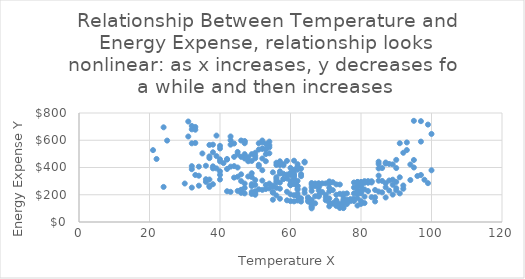
| Category | Energy Expense Y |
|---|---|
| 46.0 | 236 |
| 52.0 | 304 |
| 55.0 | 163.5 |
| 46.0 | 214 |
| 47.0 | 210 |
| 50.0 | 508 |
| 36.0 | 294.55 |
| 47.0 | 250 |
| 40.0 | 371.95 |
| 46.0 | 478 |
| 55.0 | 258 |
| 40.0 | 559 |
| 53.0 | 536 |
| 44.0 | 576 |
| 48.0 | 446 |
| 46.0 | 300 |
| 56.0 | 250.5 |
| 36.0 | 412.8 |
| 38.0 | 511.7 |
| 37.0 | 311.75 |
| 44.0 | 478 |
| 30.0 | 282.5 |
| 48.0 | 476 |
| 37.0 | 565.45 |
| 43.0 | 567.6 |
| 39.0 | 634.25 |
| 34.0 | 266.6 |
| 33.0 | 345 |
| 38.0 | 393.45 |
| 38.0 | 567.6 |
| 37.0 | 266.6 |
| 35.0 | 503.1 |
| 53.0 | 242 |
| 55.0 | 216 |
| 58.0 | 354 |
| 41.0 | 432.15 |
| 43.0 | 406.35 |
| 43.0 | 627.8 |
| 32.0 | 705 |
| 53.0 | 534 |
| 54.0 | 282 |
| 56.0 | 435 |
| 52.0 | 380 |
| 57.0 | 372 |
| 51.0 | 240 |
| 40.0 | 346.15 |
| 32.0 | 577.5 |
| 34.0 | 406.35 |
| 37.0 | 468.7 |
| 39.0 | 483.75 |
| 22.0 | 462.5 |
| 38.0 | 408.5 |
| 40.0 | 311.75 |
| 51.0 | 420 |
| 32.0 | 410 |
| 45.0 | 400 |
| 40.0 | 460.1 |
| 52.0 | 538 |
| 25.0 | 597.5 |
| 42.0 | 389.15 |
| 45.0 | 228 |
| 31.0 | 627.5 |
| 51.0 | 408 |
| 34.0 | 339.7 |
| 21.0 | 527.5 |
| 55.0 | 364.5 |
| 24.0 | 695 |
| 42.0 | 462.25 |
| 38.0 | 277.35 |
| 48.0 | 334 |
| 40.0 | 445.05 |
| 45.0 | 496 |
| 45.0 | 514 |
| 46.0 | 350 |
| 33.0 | 697.5 |
| 37.0 | 258 |
| 24.0 | 257.5 |
| 36.0 | 313.9 |
| 37.0 | 481.6 |
| 47.0 | 594 |
| 64.0 | 442.5 |
| 60.0 | 397.5 |
| 50.0 | 272 |
| 62.0 | 208.5 |
| 50.0 | 200 |
| 62.0 | 301.5 |
| 68.0 | 187 |
| 65.0 | 150 |
| 57.0 | 445.5 |
| 53.0 | 498 |
| 43.0 | 599.85 |
| 39.0 | 393.45 |
| 61.0 | 196.5 |
| 42.0 | 457.95 |
| 42.0 | 225.75 |
| 52.0 | 598 |
| 68.0 | 268 |
| 50.0 | 468 |
| 46.0 | 236 |
| 58.0 | 415.5 |
| 56.0 | 418.5 |
| 61.0 | 279 |
| 56.0 | 195 |
| 61.0 | 325.5 |
| 67.0 | 283 |
| 68.0 | 281 |
| 61.0 | 313.5 |
| 52.0 | 466 |
| 63.0 | 351 |
| 80.0 | 226 |
| 75.0 | 165 |
| 51.0 | 532 |
| 44.0 | 410 |
| 79.0 | 121 |
| 61.0 | 340.5 |
| 49.0 | 264 |
| 80.0 | 212 |
| 47.0 | 590 |
| 77.0 | 153 |
| 60.0 | 202.5 |
| 54.0 | 564 |
| 44.0 | 326 |
| 50.0 | 308 |
| 69.0 | 220 |
| 59.0 | 448.5 |
| 81.0 | 239 |
| 82.0 | 227 |
| 59.0 | 222 |
| 47.0 | 282 |
| 71.0 | 225 |
| 45.0 | 332 |
| 65.0 | 178 |
| 78.0 | 290 |
| 54.0 | 246 |
| 46.0 | 598 |
| 81.0 | 186 |
| 52.0 | 584 |
| 79.0 | 259 |
| 77.0 | 162 |
| 66.0 | 162 |
| 60.0 | 300 |
| 66.0 | 228 |
| 63.0 | 336 |
| 76.0 | 164 |
| 64.0 | 238.5 |
| 54.0 | 548 |
| 62.0 | 187.5 |
| 75.0 | 208 |
| 60.0 | 153 |
| 61.0 | 343.5 |
| 74.0 | 275 |
| 72.0 | 138 |
| 77.0 | 168 |
| 56.0 | 289.5 |
| 73.0 | 156 |
| 60.0 | 345 |
| 72.0 | 292 |
| 66.0 | 100 |
| 57.0 | 355.5 |
| 57.0 | 171 |
| 78.0 | 253 |
| 56.0 | 303 |
| 59.0 | 319.5 |
| 71.0 | 115 |
| 66.0 | 133 |
| 58.0 | 318 |
| 67.0 | 137 |
| 66.0 | 275 |
| 76.0 | 132 |
| 57.0 | 244.5 |
| 72.0 | 135 |
| 62.0 | 246 |
| 79.0 | 222 |
| 83.0 | 297 |
| 71.0 | 173 |
| 78.0 | 154 |
| 70.0 | 160 |
| 81.0 | 139 |
| 74.0 | 103 |
| 92.0 | 508 |
| 78.0 | 172 |
| 87.0 | 429 |
| 62.0 | 406.5 |
| 85.0 | 340.5 |
| 92.0 | 268 |
| 84.0 | 235 |
| 90.0 | 396 |
| 66.0 | 254 |
| 67.0 | 189 |
| 79.0 | 293 |
| 74.0 | 115 |
| 84.0 | 181 |
| 73.0 | 200 |
| 72.0 | 234 |
| 89.0 | 423 |
| 75.0 | 102 |
| 80.0 | 272 |
| 65.0 | 159 |
| 71.0 | 281 |
| 91.0 | 210 |
| 89.0 | 273 |
| 98.0 | 310 |
| 91.0 | 578 |
| 82.0 | 300 |
| 93.0 | 584 |
| 73.0 | 159 |
| 99.0 | 715 |
| 85.0 | 426 |
| 71.0 | 251 |
| 90.0 | 294 |
| 71.0 | 288 |
| 97.0 | 740 |
| 100.0 | 646.25 |
| 96.0 | 337.5 |
| 75.0 | 154 |
| 80.0 | 153 |
| 74.0 | 207 |
| 84.0 | 151 |
| 94.0 | 308 |
| 99.0 | 285 |
| 94.0 | 422 |
| 95.0 | 400 |
| 88.0 | 426 |
| 83.0 | 182 |
| 89.0 | 201 |
| 79.0 | 294 |
| 92.0 | 244 |
| 100.0 | 379.5 |
| 80.0 | 257 |
| 97.0 | 590 |
| 70.0 | 199 |
| 90.0 | 248 |
| 75.0 | 106 |
| 86.0 | 217.5 |
| 91.0 | 328 |
| 80.0 | 133 |
| 73.0 | 118 |
| 85.0 | 442.5 |
| 95.0 | 455 |
| 75.0 | 188 |
| 87.0 | 255 |
| 80.0 | 294 |
| 88.0 | 304.5 |
| 75.0 | 138 |
| 68.0 | 253 |
| 70.0 | 180 |
| 76.0 | 210 |
| 87.0 | 436.5 |
| 90.0 | 456 |
| 67.0 | 273 |
| 70.0 | 283 |
| 97.0 | 345 |
| 90.0 | 232 |
| 86.0 | 301.5 |
| 83.0 | 298 |
| 69.0 | 283 |
| 68.0 | 193 |
| 95.0 | 742.5 |
| 93.0 | 528 |
| 79.0 | 204 |
| 87.0 | 180 |
| 79.0 | 230 |
| 85.0 | 393 |
| 89.0 | 310.5 |
| 71.0 | 298 |
| 58.0 | 424.5 |
| 66.0 | 116 |
| 82.0 | 288 |
| 56.0 | 318 |
| 81.0 | 291 |
| 57.0 | 418.5 |
| 59.0 | 159 |
| 54.0 | 504 |
| 88.0 | 231 |
| 83.0 | 290 |
| 85.0 | 303 |
| 85.0 | 223.5 |
| 81.0 | 300 |
| 73.0 | 276 |
| 71.0 | 142 |
| 87.0 | 285 |
| 86.0 | 396 |
| 79.0 | 265 |
| 61.0 | 151.5 |
| 60.0 | 361.5 |
| 78.0 | 210 |
| 81.0 | 288 |
| 79.0 | 174 |
| 68.0 | 260 |
| 68.0 | 197 |
| 60.0 | 276 |
| 73.0 | 137 |
| 74.0 | 132 |
| 46.0 | 224 |
| 66.0 | 131 |
| 50.0 | 210 |
| 49.0 | 498 |
| 68.0 | 284 |
| 63.0 | 150 |
| 57.0 | 289.5 |
| 62.0 | 237 |
| 66.0 | 136 |
| 62.0 | 424.5 |
| 53.0 | 574 |
| 63.0 | 391.5 |
| 61.0 | 382.5 |
| 64.0 | 436.5 |
| 51.0 | 578 |
| 56.0 | 328.5 |
| 54.0 | 590 |
| 53.0 | 446 |
| 50.0 | 226 |
| 68.0 | 231 |
| 58.0 | 315 |
| 49.0 | 220 |
| 67.0 | 264 |
| 49.0 | 358 |
| 47.0 | 498 |
| 49.0 | 448 |
| 47.0 | 578 |
| 62.0 | 402 |
| 47.0 | 466 |
| 49.0 | 330 |
| 64.0 | 214.5 |
| 62.0 | 190.5 |
| 60.0 | 270 |
| 66.0 | 109 |
| 62.0 | 384 |
| 66.0 | 286 |
| 49.0 | 278 |
| 62.0 | 264 |
| 65.0 | 179 |
| 62.0 | 265.5 |
| 61.0 | 357 |
| 31.0 | 737.5 |
| 53.0 | 272 |
| 52.0 | 236 |
| 55.0 | 267 |
| 61.0 | 450 |
| 50.0 | 486 |
| 55.0 | 217.5 |
| 60.0 | 274.5 |
| 43.0 | 221.45 |
| 63.0 | 174 |
| 49.0 | 206 |
| 40.0 | 539.65 |
| 33.0 | 677.5 |
| 62.0 | 157.5 |
| 32.0 | 680 |
| 33.0 | 580 |
| 52.0 | 538 |
| 32.0 | 252.5 |
| 59.0 | 348 |
| 32.0 | 387.5 |